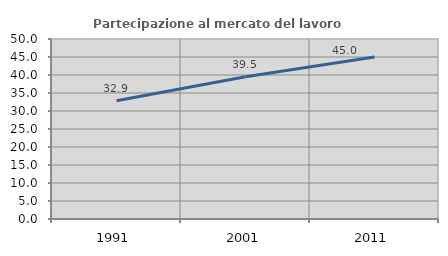
| Category | Partecipazione al mercato del lavoro  femminile |
|---|---|
| 1991.0 | 32.85 |
| 2001.0 | 39.535 |
| 2011.0 | 45 |